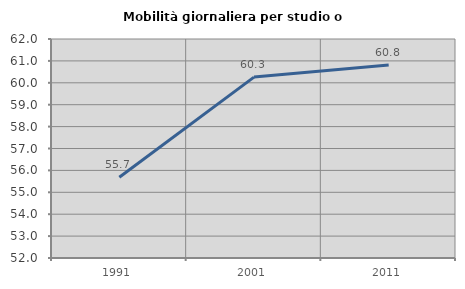
| Category | Mobilità giornaliera per studio o lavoro |
|---|---|
| 1991.0 | 55.686 |
| 2001.0 | 60.261 |
| 2011.0 | 60.815 |